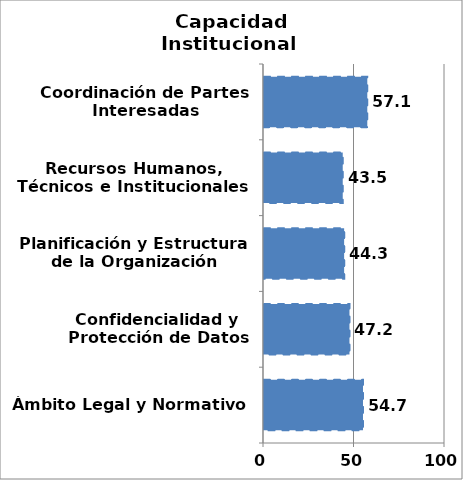
| Category | Series 0 |
|---|---|
| Ámbito Legal y Normativo | 54.691 |
| Confidencialidad y Protección de Datos | 47.222 |
| Planificación y Estructura de la Organización | 44.274 |
| Recursos Humanos, Técnicos e Institucionales | 43.504 |
| Coordinación de Partes Interesadas | 57.071 |